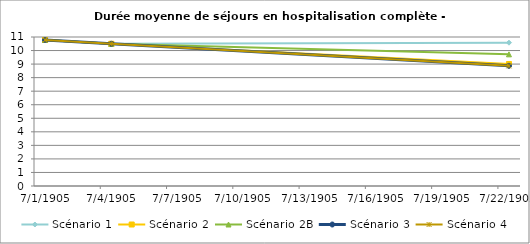
| Category | Scénario 1 | Scénario 2 | Scénario 2B | Scénario 3 | Scénario 4 |
|---|---|---|---|---|---|
| 2009.0 | 10.781 | 10.781 | 10.781 | 10.781 | 10.781 |
| 2012.0 | 10.499 | 10.499 | 10.499 | 10.499 | 10.499 |
| 2030.0 | 10.581 | 9.008 | 9.72 | 8.872 | 8.872 |